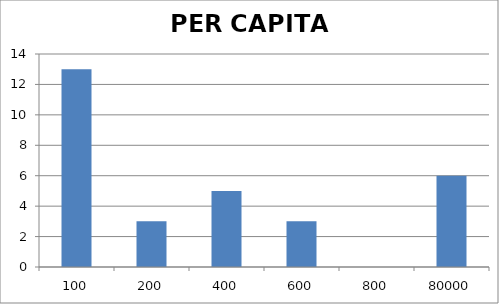
| Category | Series 0 |
|---|---|
| 100.0 | 13 |
| 200.0 | 3 |
| 400.0 | 5 |
| 600.0 | 3 |
| 800.0 | 0 |
| 80000.0 | 6 |